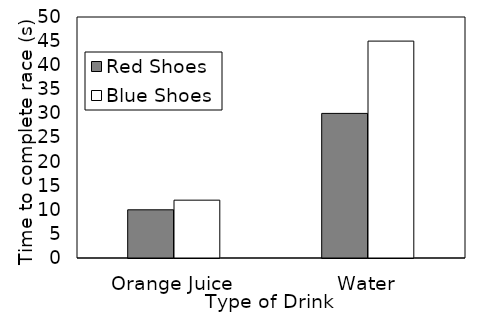
| Category | Red Shoes | Blue Shoes |
|---|---|---|
| Orange Juice | 10 | 12 |
| Water | 30 | 45 |